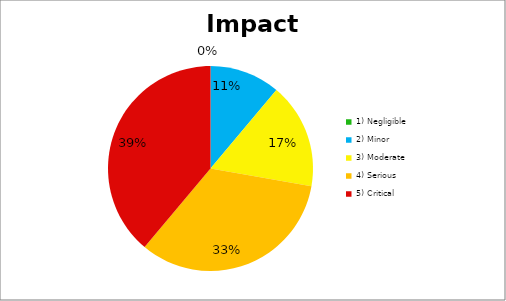
| Category | Series 1 |
|---|---|
| 1) Negligible | 0 |
| 2) Minor | 2 |
| 3) Moderate | 3 |
| 4) Serious | 6 |
| 5) Critical | 7 |